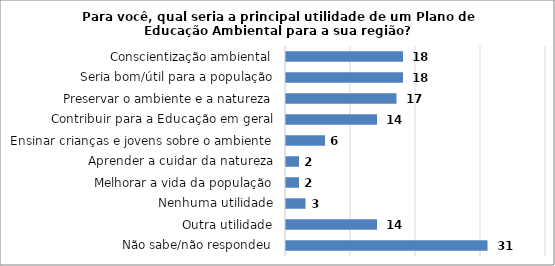
| Category | Series 0 |
|---|---|
| Não sabe/não respondeu | 31 |
| Outra utilidade | 14 |
| Nenhuma utilidade | 3 |
| Melhorar a vida da população | 2 |
| Aprender a cuidar da natureza | 2 |
| Ensinar crianças e jovens sobre o ambiente | 6 |
| Contribuir para a Educação em geral | 14 |
| Preservar o ambiente e a natureza | 17 |
| Seria bom/útil para a população | 18 |
| Conscientização ambiental | 18 |